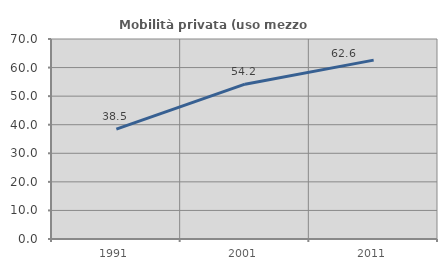
| Category | Mobilità privata (uso mezzo privato) |
|---|---|
| 1991.0 | 38.469 |
| 2001.0 | 54.194 |
| 2011.0 | 62.606 |